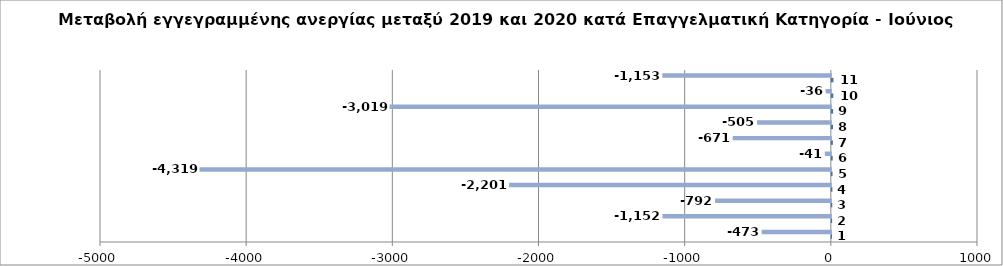
| Category | Series 0 | Series 1 |
|---|---|---|
| 0 | 1 | -473 |
| 1 | 2 | -1152 |
| 2 | 3 | -792 |
| 3 | 4 | -2201 |
| 4 | 5 | -4319 |
| 5 | 6 | -41 |
| 6 | 7 | -671 |
| 7 | 8 | -505 |
| 8 | 9 | -3019 |
| 9 | 10 | -36 |
| 10 | 11 | -1153 |